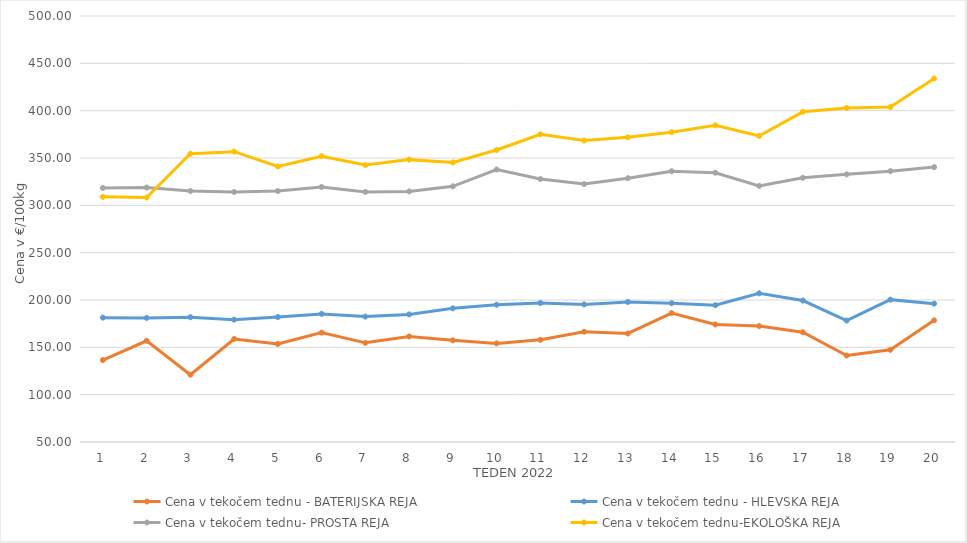
| Category | Cena v tekočem tednu - BATERIJSKA REJA | Cena v tekočem tednu - HLEVSKA REJA | Cena v tekočem tednu- PROSTA REJA | Cena v tekočem tednu-EKOLOŠKA REJA |
|---|---|---|---|---|
| 1.0 | 136.59 | 181.38 | 318.4 | 308.97 |
| 2.0 | 156.88 | 181.07 | 318.82 | 308.28 |
| 3.0 | 121.07 | 181.83 | 315.14 | 354.48 |
| 4.0 | 158.82 | 179.22 | 314.08 | 356.72 |
| 5.0 | 153.55 | 181.96 | 315.1 | 341.03 |
| 6.0 | 165.51 | 185.31 | 319.38 | 351.9 |
| 7.0 | 154.74 | 182.45 | 314.16 | 342.59 |
| 8.0 | 161.48 | 184.77 | 314.71 | 348.28 |
| 9.0 | 157.38 | 191.21 | 320.1 | 345.35 |
| 10.0 | 154.16 | 195.04 | 337.83 | 358.45 |
| 11.0 | 157.96 | 196.88 | 327.79 | 375 |
| 12.0 | 166.49 | 195.36 | 322.46 | 368.45 |
| 13.0 | 164.66 | 197.95 | 328.67 | 371.9 |
| 14.0 | 186.11 | 196.59 | 336.02 | 377.24 |
| 15.0 | 174.18 | 194.49 | 334.46 | 384.48 |
| 16.0 | 172.42 | 207.1 | 320.58 | 373.28 |
| 17.0 | 165.96 | 199.41 | 329.11 | 398.79 |
| 18.0 | 141.36 | 178.29 | 332.71 | 402.93 |
| 19.0 | 147.43 | 200.37 | 336.11 | 403.79 |
| 20.0 | 178.51 | 196.16 | 340.4 | 433.97 |